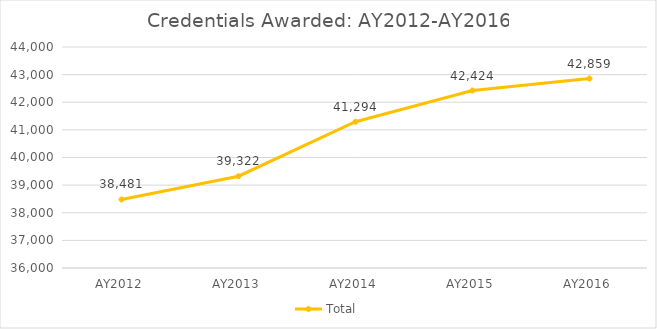
| Category | Total |
|---|---|
| AY2012 | 38481 |
| AY2013 | 39322 |
| AY2014 | 41294 |
| AY2015 | 42424 |
| AY2016 | 42859 |